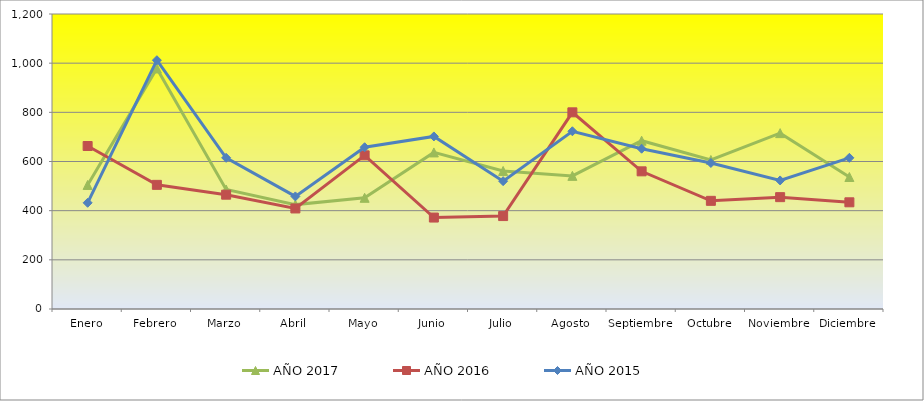
| Category | AÑO 2017 | AÑO 2016 | AÑO 2015 |
|---|---|---|---|
| Enero | 504.615 | 663 | 432 |
| Febrero | 978.462 | 505 | 1012 |
| Marzo | 486.154 | 465 | 615 |
| Abril | 424.615 | 409 | 458 |
| Mayo | 452.308 | 625 | 658 |
| Junio | 636.923 | 372 | 702 |
| Julio | 561.538 | 378 | 520 |
| Agosto | 541.538 | 800 | 723 |
| Septiembre | 684.615 | 560 | 652 |
| Octubre | 606.154 | 440 | 594 |
| Noviembre | 715.385 | 455 | 523 |
| Diciembre | 536.923 | 434 | 615 |